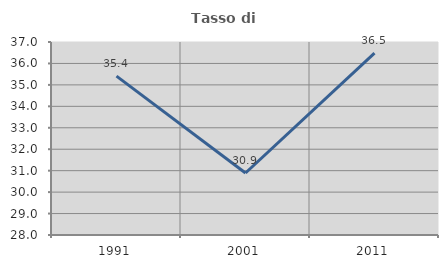
| Category | Tasso di occupazione   |
|---|---|
| 1991.0 | 35.409 |
| 2001.0 | 30.89 |
| 2011.0 | 36.478 |